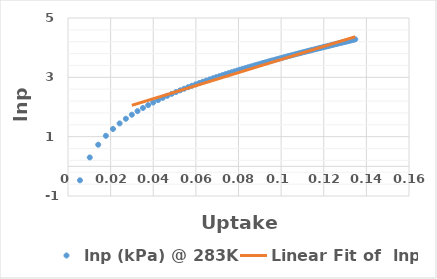
| Category | lnp (kPa) @ 283K |
|---|---|
| 0.00561 | -0.471 |
| 0.01021 | 0.3 |
| 0.01418 | 0.729 |
| 0.01778 | 1.029 |
| 0.02111 | 1.26 |
| 0.02422 | 1.446 |
| 0.02716 | 1.604 |
| 0.02996 | 1.74 |
| 0.03262 | 1.86 |
| 0.03517 | 1.967 |
| 0.03762 | 2.064 |
| 0.03998 | 2.152 |
| 0.04226 | 2.233 |
| 0.04446 | 2.308 |
| 0.04658 | 2.377 |
| 0.04865 | 2.442 |
| 0.05065 | 2.503 |
| 0.0526 | 2.561 |
| 0.05449 | 2.615 |
| 0.05634 | 2.667 |
| 0.05813 | 2.716 |
| 0.05988 | 2.763 |
| 0.06159 | 2.808 |
| 0.06326 | 2.851 |
| 0.06489 | 2.892 |
| 0.06649 | 2.931 |
| 0.06804 | 2.969 |
| 0.06957 | 3.006 |
| 0.07106 | 3.041 |
| 0.07253 | 3.075 |
| 0.07396 | 3.108 |
| 0.07537 | 3.14 |
| 0.07674 | 3.171 |
| 0.0781 | 3.201 |
| 0.07942 | 3.23 |
| 0.08073 | 3.258 |
| 0.082 | 3.285 |
| 0.08326 | 3.312 |
| 0.08449 | 3.338 |
| 0.08571 | 3.364 |
| 0.0869 | 3.389 |
| 0.08807 | 3.413 |
| 0.08923 | 3.436 |
| 0.09036 | 3.459 |
| 0.09148 | 3.482 |
| 0.09258 | 3.504 |
| 0.09366 | 3.526 |
| 0.09472 | 3.547 |
| 0.09577 | 3.567 |
| 0.09681 | 3.588 |
| 0.09783 | 3.608 |
| 0.09883 | 3.627 |
| 0.09982 | 3.646 |
| 0.10079 | 3.665 |
| 0.10175 | 3.683 |
| 0.1027 | 3.701 |
| 0.10364 | 3.719 |
| 0.10456 | 3.736 |
| 0.10547 | 3.754 |
| 0.10637 | 3.77 |
| 0.10725 | 3.787 |
| 0.10813 | 3.803 |
| 0.10899 | 3.819 |
| 0.10984 | 3.835 |
| 0.11068 | 3.851 |
| 0.11151 | 3.866 |
| 0.11233 | 3.881 |
| 0.11314 | 3.896 |
| 0.11394 | 3.91 |
| 0.11473 | 3.925 |
| 0.11551 | 3.939 |
| 0.11628 | 3.953 |
| 0.11705 | 3.967 |
| 0.1178 | 3.981 |
| 0.11854 | 3.994 |
| 0.11928 | 4.007 |
| 0.12001 | 4.02 |
| 0.12073 | 4.033 |
| 0.12144 | 4.046 |
| 0.12214 | 4.059 |
| 0.12284 | 4.071 |
| 0.12353 | 4.083 |
| 0.12421 | 4.096 |
| 0.12488 | 4.108 |
| 0.12555 | 4.119 |
| 0.12621 | 4.131 |
| 0.12686 | 4.143 |
| 0.12751 | 4.154 |
| 0.12815 | 4.166 |
| 0.12878 | 4.177 |
| 0.1294 | 4.188 |
| 0.13002 | 4.199 |
| 0.13064 | 4.21 |
| 0.13125 | 4.22 |
| 0.13185 | 4.231 |
| 0.13244 | 4.241 |
| 0.13303 | 4.252 |
| 0.13362 | 4.262 |
| 0.13419 | 4.272 |
| 0.13477 | 4.282 |